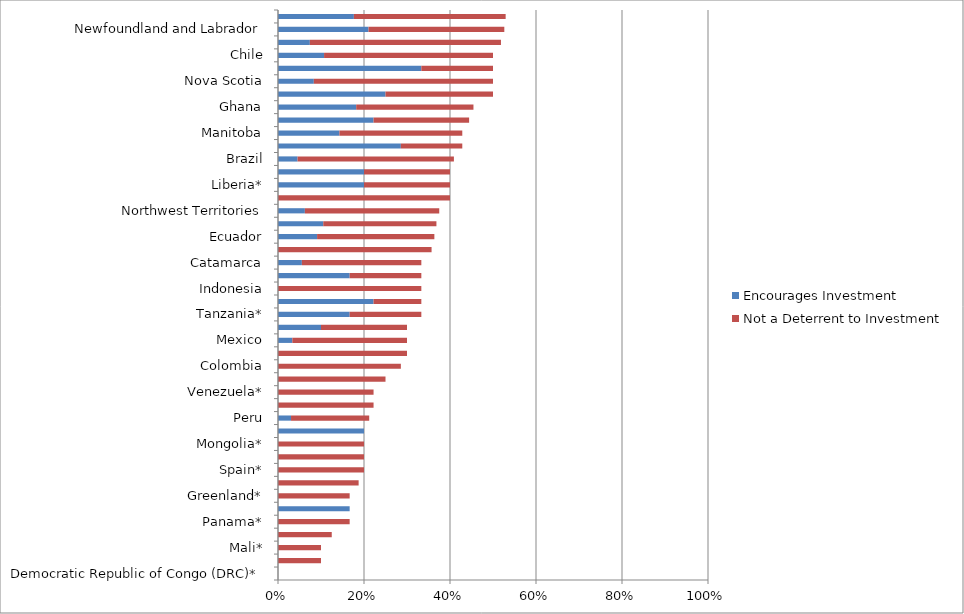
| Category | Encourages Investment | Not a Deterrent to Investment |
|---|---|---|
| Democratic Republic of Congo (DRC)* | 0 | 0 |
| Turkey | 0 | 0.1 |
| Mali* | 0 | 0.1 |
| Nicaragua* | 0 | 0.125 |
| Panama* | 0 | 0.167 |
| Niger* | 0.167 | 0 |
| Greenland* | 0 | 0.167 |
| Bolivia | 0 | 0.188 |
| Spain* | 0 | 0.2 |
| Philippines* | 0 | 0.2 |
| Mongolia* | 0 | 0.2 |
| Kyrgyzstan* | 0.2 | 0 |
| Peru | 0.03 | 0.182 |
| Zimbabwe* | 0 | 0.222 |
| Venezuela* | 0 | 0.222 |
| Papua New Guinea | 0 | 0.25 |
| Colombia | 0 | 0.286 |
| South Africa | 0 | 0.3 |
| Mexico | 0.033 | 0.267 |
| Guinea (Conakry) | 0.1 | 0.2 |
| Tanzania* | 0.167 | 0.167 |
| Jujuy | 0.222 | 0.111 |
| Indonesia | 0 | 0.333 |
| Guyana* | 0.167 | 0.167 |
| Catamarca | 0.056 | 0.278 |
| Chubut | 0 | 0.357 |
| Ecuador | 0.091 | 0.273 |
| Nunavut | 0.105 | 0.263 |
| Northwest Territories | 0.062 | 0.312 |
| Mendoza* | 0 | 0.4 |
| Liberia* | 0.2 | 0.2 |
| Burkina Faso* | 0.2 | 0.2 |
| Brazil | 0.045 | 0.364 |
| Russia* | 0.286 | 0.143 |
| Manitoba | 0.143 | 0.286 |
| La Rioja | 0.222 | 0.222 |
| Ghana | 0.182 | 0.273 |
| Washington* | 0.25 | 0.25 |
| Nova Scotia | 0.083 | 0.417 |
| Kazakhstan | 0.333 | 0.167 |
| Chile | 0.107 | 0.393 |
| New South Wales | 0.074 | 0.444 |
| Newfoundland and Labrador | 0.211 | 0.316 |
| Santa Cruz | 0.176 | 0.353 |